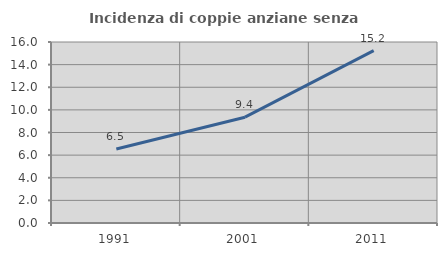
| Category | Incidenza di coppie anziane senza figli  |
|---|---|
| 1991.0 | 6.538 |
| 2001.0 | 9.353 |
| 2011.0 | 15.233 |